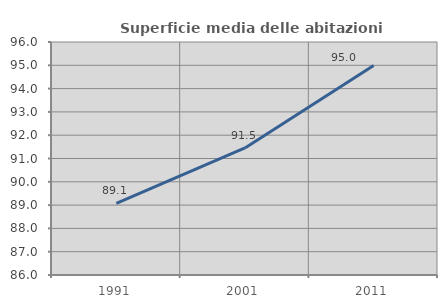
| Category | Superficie media delle abitazioni occupate |
|---|---|
| 1991.0 | 89.07 |
| 2001.0 | 91.453 |
| 2011.0 | 94.995 |